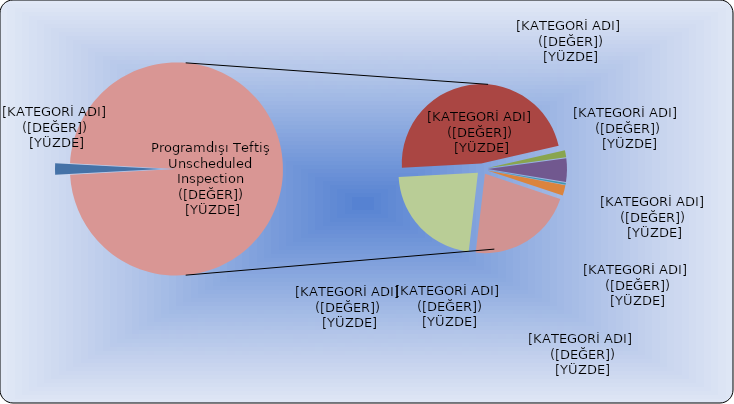
| Category | Series 0 |
|---|---|
| Programlı teftiş
Scheduled inspections | 148 |
| Şahsi inceleme
Personal reviews | 3991 |
| Yabancı çalışma izni Work permits of non-residents | 122 |
| Toplu işten çıkarma Massive layoffs | 401 |
| Altişveren Sub-employer  | 34 |
| İşkolu incelemesi Branch reviews | 179 |
| Zorunlu istihdam Mandatory employment | 2 |
| Kısa çalışma şikayet Short-term employment complaints  | 1834 |
| Diğer inceleme Other reviews | 1881 |